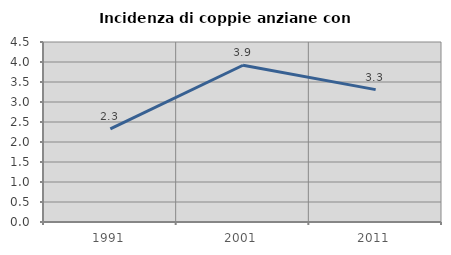
| Category | Incidenza di coppie anziane con figli |
|---|---|
| 1991.0 | 2.33 |
| 2001.0 | 3.919 |
| 2011.0 | 3.31 |